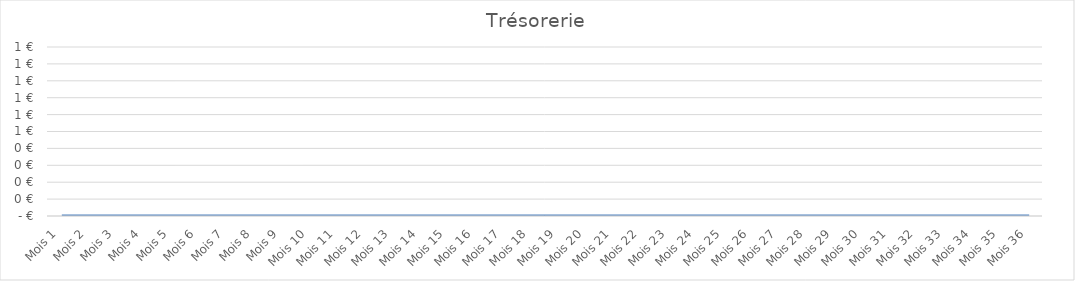
| Category | Trésorerie |
|---|---|
| Mois 1 | 0 |
| Mois 2 | 0 |
| Mois 3 | 0 |
| Mois 4 | 0 |
| Mois 5 | 0 |
| Mois 6 | 0 |
| Mois 7 | 0 |
| Mois 8 | 0 |
| Mois 9 | 0 |
| Mois 10 | 0 |
| Mois 11 | 0 |
| Mois 12 | 0 |
| Mois 13 | 0 |
| Mois 14 | 0 |
| Mois 15 | 0 |
| Mois 16 | 0 |
| Mois 17 | 0 |
| Mois 18 | 0 |
| Mois 19 | 0 |
| Mois 20 | 0 |
| Mois 21 | 0 |
| Mois 22 | 0 |
| Mois 23 | 0 |
| Mois 24 | 0 |
| Mois 25 | 0 |
| Mois 26 | 0 |
| Mois 27 | 0 |
| Mois 28 | 0 |
| Mois 29 | 0 |
| Mois 30 | 0 |
| Mois 31 | 0 |
| Mois 32 | 0 |
| Mois 33 | 0 |
| Mois 34 | 0 |
| Mois 35 | 0 |
| Mois 36 | 0 |